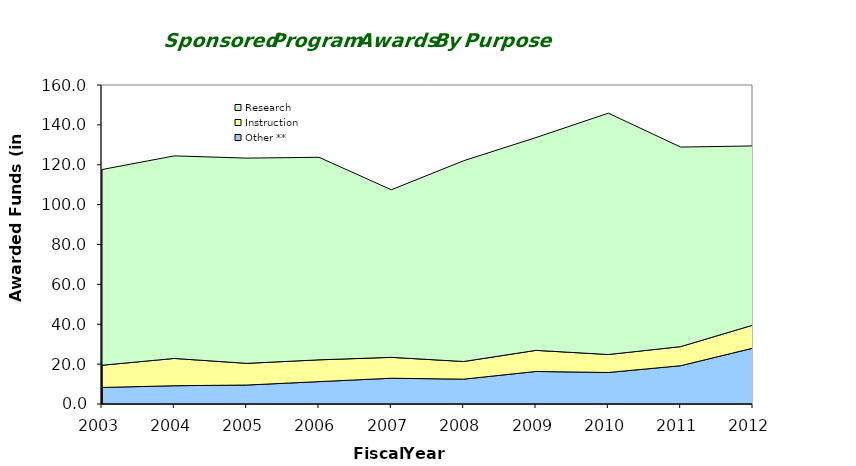
| Category | Other ** | Instruction | Research |
|---|---|---|---|
| 2003.0 | 8293404 | 11147061 | 98160245 |
| 2004.0 | 9163550 | 13682608 | 101608152 |
| 2005.0 | 9513598 | 10871860 | 102942459 |
| 2006.0 | 11219718 | 10932352 | 101586645 |
| 2007.0 | 12923580 | 10473404 | 84050822 |
| 2008.0 | 12461556 | 8854473 | 100702258 |
| 2009.0 | 16323762 | 10579962 | 106738539 |
| 2010.0 | 15802845 | 9016188 | 121058086 |
| 2011.0 | 19201991 | 9571284 | 100091965 |
| 2012.0 | 28029550 | 11550592 | 89859671 |